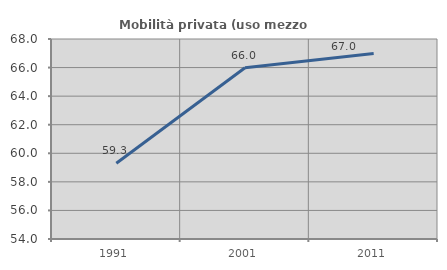
| Category | Mobilità privata (uso mezzo privato) |
|---|---|
| 1991.0 | 59.3 |
| 2001.0 | 65.983 |
| 2011.0 | 66.99 |